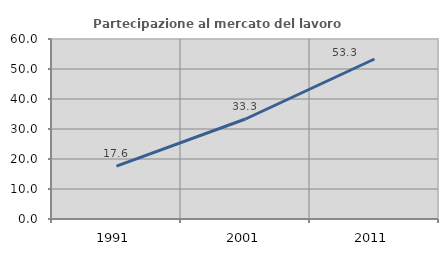
| Category | Partecipazione al mercato del lavoro  femminile |
|---|---|
| 1991.0 | 17.647 |
| 2001.0 | 33.333 |
| 2011.0 | 53.333 |